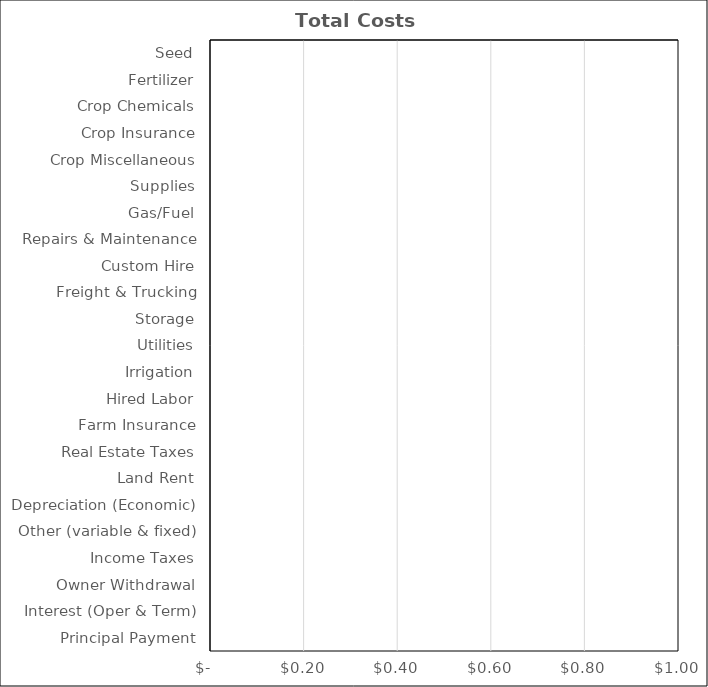
| Category | Soybeans |
|---|---|
| Seed | 0 |
| Fertilizer | 0 |
| Crop Chemicals | 0 |
| Crop Insurance | 0 |
| Crop Miscellaneous | 0 |
| Supplies | 0 |
| Gas/Fuel | 0 |
| Repairs & Maintenance | 0 |
| Custom Hire | 0 |
| Freight & Trucking | 0 |
| Storage | 0 |
| Utilities | 0 |
| Irrigation | 0 |
| Hired Labor | 0 |
| Farm Insurance | 0 |
| Real Estate Taxes | 0 |
| Land Rent | 0 |
| Depreciation (Economic) | 0 |
| Other (variable & fixed) | 0 |
| Income Taxes | 0 |
| Owner Withdrawal | 0 |
| Interest (Oper & Term) | 0 |
| Principal Payment | 0 |